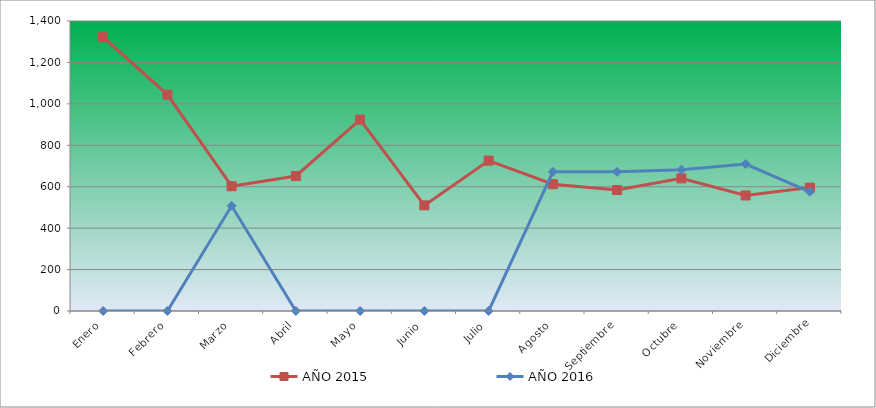
| Category | AÑO 2015 | AÑO 2016 |
|---|---|---|
| Enero | 1321.782 | 0 |
| Febrero | 1044.554 | 0 |
| Marzo | 602.31 | 507.793 |
| Abril | 651.815 | 0 |
| Mayo | 924.092 | 0 |
| Junio | 509.901 | 0 |
| Julio | 726.073 | 0 |
| Agosto | 612.211 | 671.979 |
| Septiembre | 584.158 | 671.979 |
| Octubre | 640.264 | 682.135 |
| Noviembre | 557.756 | 709.217 |
| Diciembre | 595.71 | 575.499 |